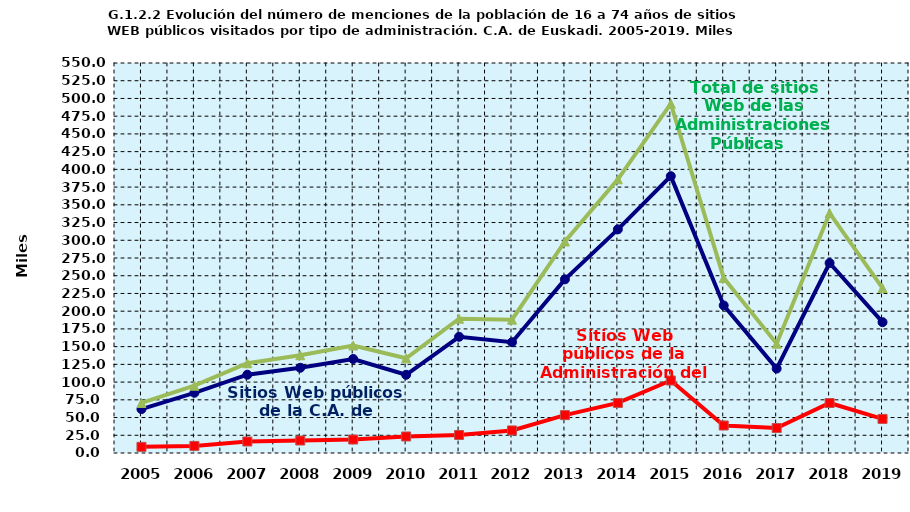
| Category | Sitios Web públicos de la C.A. de Euskadi | Sitios Web públicos de la Administración del Estado | Total de sitios Web de las Administraciones Públicas |
|---|---|---|---|
| 2005.0 | 61.9 | 8.7 | 70.6 |
| 2006.0 | 84.9 | 10 | 94.9 |
| 2007.0 | 110.4 | 16.2 | 126.6 |
| 2008.0 | 120.2 | 17.6 | 137.8 |
| 2009.0 | 132.6 | 19 | 151.6 |
| 2010.0 | 110.3 | 23.3 | 133.6 |
| 2011.0 | 163.9 | 25.4 | 189.3 |
| 2012.0 | 156.2 | 31.8 | 188 |
| 2013.0 | 244.9 | 53.4 | 298.3 |
| 2014.0 | 315.4 | 70.6 | 386 |
| 2015.0 | 390.4 | 102.2 | 492.6 |
| 2016.0 | 208.1 | 38.8 | 246.9 |
| 2017.0 | 119 | 35.2 | 154.2 |
| 2018.0 | 267.9 | 70.5 | 338.4 |
| 2019.0 | 184.5 | 48.1 | 232.6 |